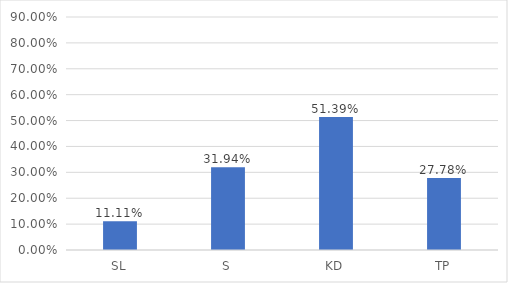
| Category | SL S KD TP |
|---|---|
| SL | 0.111 |
| S | 0.319 |
| KD | 0.514 |
| TP | 0.278 |